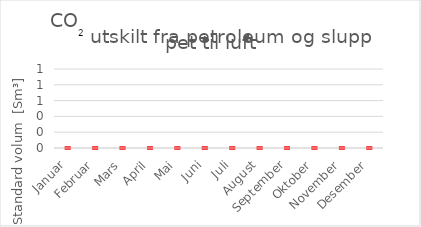
| Category | Series 0 |
|---|---|
| Januar | 0 |
| Februar | 0 |
| Mars | 0 |
| April | 0 |
| Mai | 0 |
| Juni | 0 |
| Juli | 0 |
| August | 0 |
| September | 0 |
| Oktober | 0 |
| November | 0 |
| Desember | 0 |